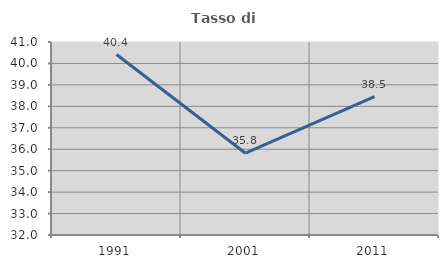
| Category | Tasso di occupazione   |
|---|---|
| 1991.0 | 40.415 |
| 2001.0 | 35.813 |
| 2011.0 | 38.452 |